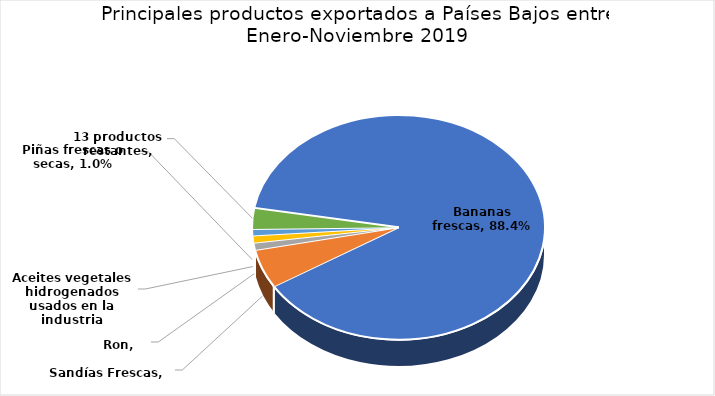
| Category | Series 0 |
|---|---|
| Bananas frescas | 0.884 |
| Sandías Frescas | 0.056 |
| Ron | 0.01 |
| Aceites vegetales hidrogenados usados en la industria alimenticia. | 0.01 |
| Piñas frescas o secas | 0.01 |
| 13 productos restantes | 0.03 |